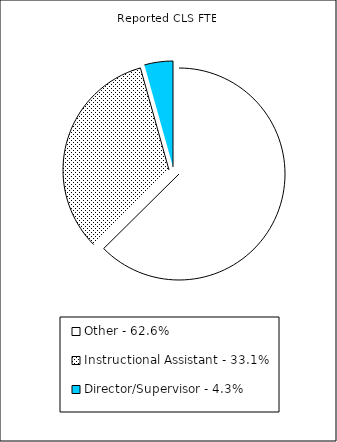
| Category | Reported FTE |
|---|---|
| Other - 62.6% | 25651.78 |
| Instructional Assistant - 33.1% | 13553.23 |
| Director/Supervisor - 4.3% | 1782.36 |